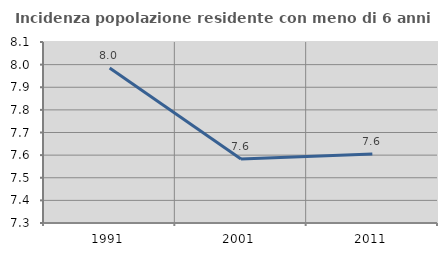
| Category | Incidenza popolazione residente con meno di 6 anni |
|---|---|
| 1991.0 | 7.985 |
| 2001.0 | 7.583 |
| 2011.0 | 7.605 |